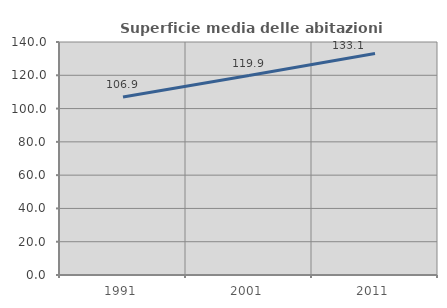
| Category | Superficie media delle abitazioni occupate |
|---|---|
| 1991.0 | 106.949 |
| 2001.0 | 119.859 |
| 2011.0 | 133.106 |